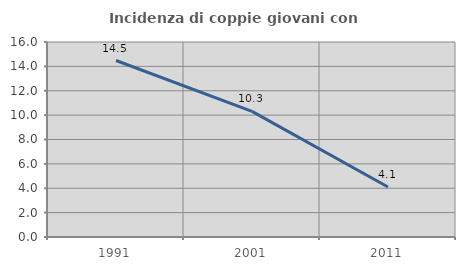
| Category | Incidenza di coppie giovani con figli |
|---|---|
| 1991.0 | 14.48 |
| 2001.0 | 10.305 |
| 2011.0 | 4.098 |